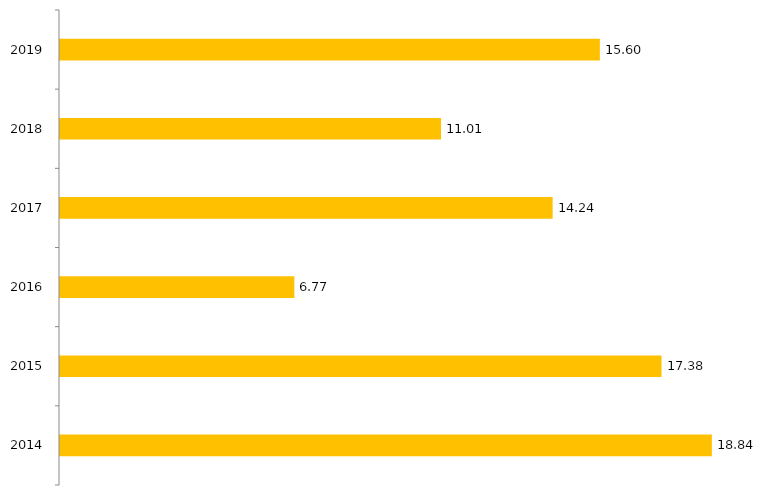
| Category | Relaçãocandidato x vaga sisu |
|---|---|
| 2014.0 | 18.84 |
| 2015.0 | 17.385 |
| 2016.0 | 6.773 |
| 2017.0 | 14.238 |
| 2018.0 | 11.012 |
| 2019.0 | 15.603 |